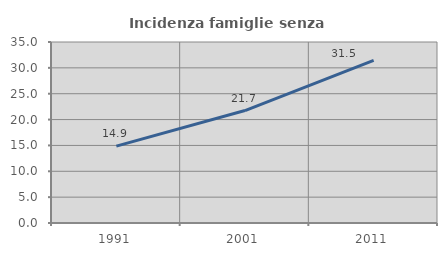
| Category | Incidenza famiglie senza nuclei |
|---|---|
| 1991.0 | 14.856 |
| 2001.0 | 21.747 |
| 2011.0 | 31.457 |